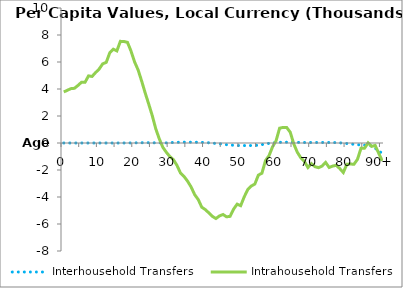
| Category | Interhousehold Transfers | Intrahousehold Transfers |
|---|---|---|
| 0 | 0 | 3781.773 |
|  | 0 | 3903.995 |
| 2 | 0 | 4026.216 |
| 3 | 0 | 4051.515 |
| 4 | 0 | 4261.076 |
| 5 | 0 | 4496.962 |
| 6 | 0 | 4495.82 |
| 7 | 0 | 4969.909 |
| 8 | 0 | 4930.979 |
| 9 | 0 | 5221.573 |
| 10 | 0 | 5480.293 |
| 11 | 0 | 5863.558 |
| 12 | 0 | 5973.309 |
| 13 | 0 | 6681.525 |
| 14 | 0 | 6949.534 |
| 15 | 0 | 6821.268 |
| 16 | 0 | 7529 |
| 17 | 1.746 | 7520.075 |
| 18 | 3.787 | 7455.536 |
| 19 | 6.414 | 6815.763 |
| 20 | 8.756 | 6013.416 |
| 21 | 13.68 | 5418.915 |
| 22 | 18.914 | 4597.579 |
| 23 | 27.36 | 3714.784 |
| 24 | 20.829 | 2890.028 |
| 25 | 12.91 | 2036.758 |
| 26 | 11.613 | 1048.695 |
| 27 | 11.018 | 303.716 |
| 28 | 2.321 | -318.949 |
| 29 | 9.307 | -694.4 |
| 30 | 26.533 | -1007.114 |
| 31 | 38.198 | -1236.705 |
| 32 | 47.211 | -1662.166 |
| 33 | 57.736 | -2233.247 |
| 34 | 64.456 | -2484.855 |
| 35 | 64.117 | -2831.643 |
| 36 | 59.446 | -3263.528 |
| 37 | 54.21 | -3827.896 |
| 38 | 52.464 | -4187.685 |
| 39 | 46.052 | -4755.772 |
| 40 | 31.507 | -4932.913 |
| 41 | 15.166 | -5176.597 |
| 42 | -7.887 | -5434.638 |
| 43 | -34.975 | -5594.008 |
| 44 | -53.615 | -5402.333 |
| 45 | -91.539 | -5296.336 |
| 46 | -125.618 | -5466.962 |
| 47 | -148.181 | -5434.853 |
| 48 | -168.246 | -4896.94 |
| 49 | -186.235 | -4528.595 |
| 50 | -188.57 | -4643.061 |
| 51 | -191.504 | -3987.669 |
| 52 | -190.106 | -3450.989 |
| 53 | -189.553 | -3187.995 |
| 54 | -185.083 | -3038.726 |
| 55 | -160.008 | -2378.653 |
| 56 | -117.534 | -2237.746 |
| 57 | -76.076 | -1309.739 |
| 58 | -27.361 | -939.915 |
| 59 | 8.518 | -286.821 |
| 60 | 36.058 | 171.044 |
| 61 | 50.687 | 1098.325 |
| 62 | 59.808 | 1154.542 |
| 63 | 56.498 | 1146.953 |
| 64 | 57.197 | 801.923 |
| 65 | 56.234 | -64.499 |
| 66 | 46.84 | -683.813 |
| 67 | 37.582 | -1102.415 |
| 68 | 36.393 | -1362.816 |
| 69 | 40.159 | -1815.381 |
| 70 | 37.924 | -1529.468 |
| 71 | 38.79 | -1755.405 |
| 72 | 38.47 | -1827.828 |
| 73 | 37.561 | -1709.206 |
| 74 | 33.515 | -1437.684 |
| 75 | 35.565 | -1811.844 |
| 76 | 37.037 | -1709.147 |
| 77 | 24.476 | -1651.725 |
| 78 | 10.08 | -1894.889 |
| 79 | -7.656 | -2186.37 |
| 80 | -39.067 | -1573.024 |
| 81 | -64.651 | -1556.947 |
| 82 | -100.779 | -1576.903 |
| 83 | -132.368 | -1211.536 |
| 84 | -129.818 | -388.294 |
| 85 | -158.593 | -383.573 |
| 86 | -211.306 | 7.168 |
| 87 | -197.037 | -250.475 |
| 88 | -385.29 | -182.334 |
| 89 | -577.265 | -753.33 |
| 90+ | -769.24 | -1324.327 |